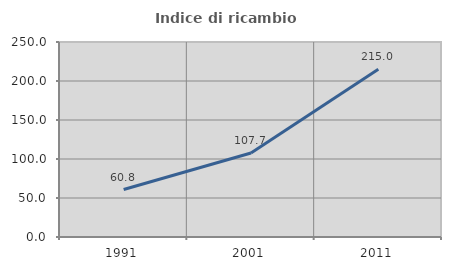
| Category | Indice di ricambio occupazionale  |
|---|---|
| 1991.0 | 60.819 |
| 2001.0 | 107.666 |
| 2011.0 | 215.021 |